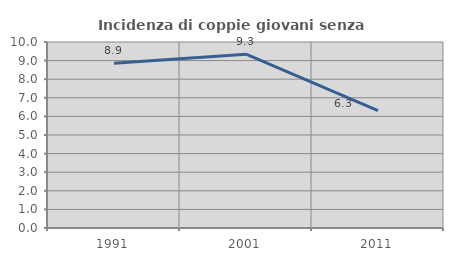
| Category | Incidenza di coppie giovani senza figli |
|---|---|
| 1991.0 | 8.864 |
| 2001.0 | 9.345 |
| 2011.0 | 6.316 |